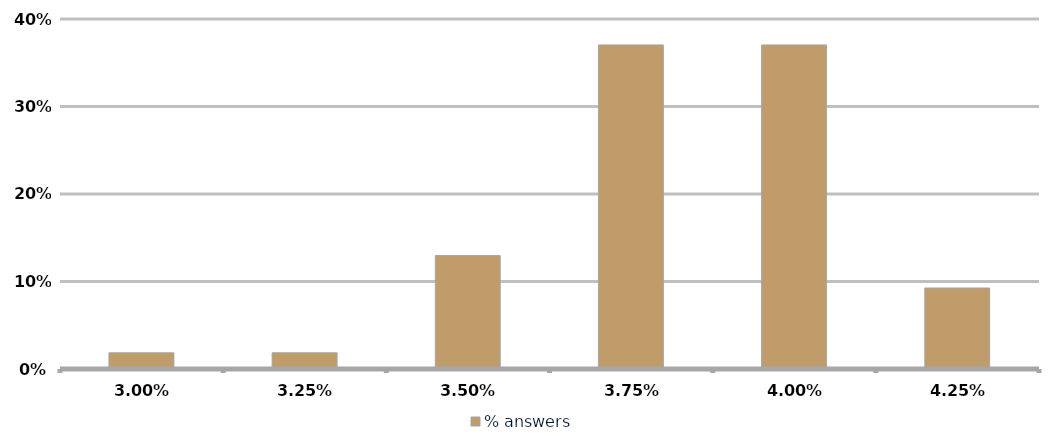
| Category | % answers |
|---|---|
| 0.029999999999999995 | 0.019 |
| 0.032499999999999994 | 0.019 |
| 0.034999999999999996 | 0.13 |
| 0.0375 | 0.37 |
| 0.04 | 0.37 |
| 0.0425 | 0.093 |